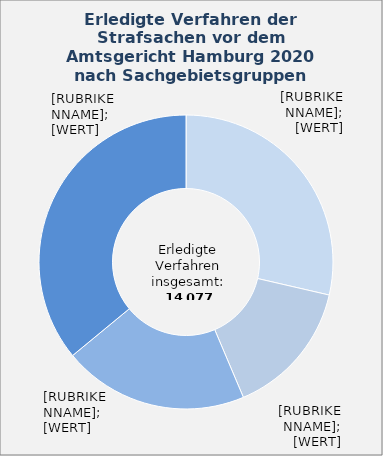
| Category | in Prozent |
|---|---|
| Eigentums- und Vermögensdelikte | 28.6 |
| Straftaten gegen das Leben und gegen die körperliche Unversehrtheit | 15 |
| Sonstige Straftaten | 20.4 |
| Übrige Sachgebietsgruppen¹ | 35.96 |